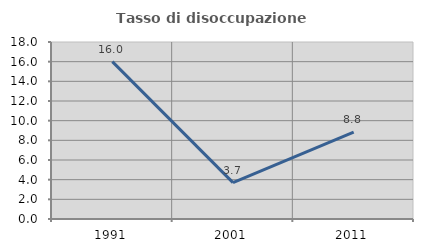
| Category | Tasso di disoccupazione giovanile  |
|---|---|
| 1991.0 | 16 |
| 2001.0 | 3.704 |
| 2011.0 | 8.824 |